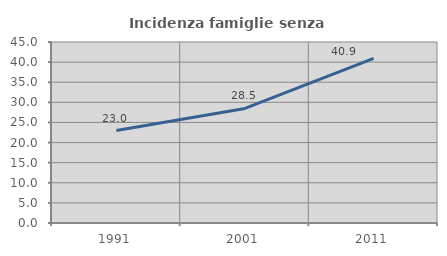
| Category | Incidenza famiglie senza nuclei |
|---|---|
| 1991.0 | 22.997 |
| 2001.0 | 28.475 |
| 2011.0 | 40.924 |